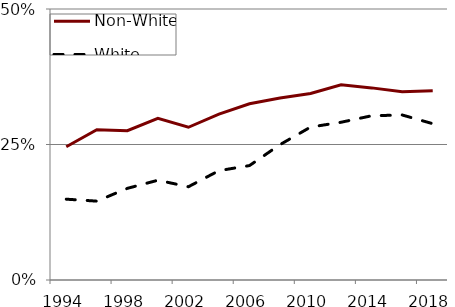
| Category | Non-White | White |
|---|---|---|
| 1994.0 | 0.246 | 0.149 |
| 1996.0 | 0.277 | 0.146 |
| 1998.0 | 0.276 | 0.169 |
| 2000.0 | 0.298 | 0.184 |
| 2002.0 | 0.282 | 0.172 |
| 2004.0 | 0.306 | 0.202 |
| 2006.0 | 0.325 | 0.211 |
| 2008.0 | 0.336 | 0.25 |
| 2010.0 | 0.344 | 0.282 |
| 2012.0 | 0.36 | 0.291 |
| 2014.0 | 0.354 | 0.303 |
| 2016.0 | 0.347 | 0.304 |
| 2018.0 | 0.349 | 0.288 |